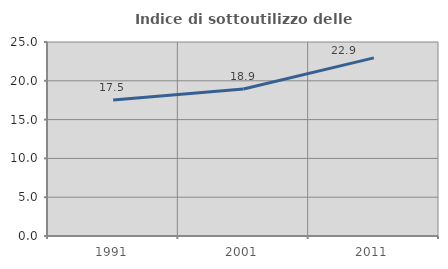
| Category | Indice di sottoutilizzo delle abitazioni  |
|---|---|
| 1991.0 | 17.517 |
| 2001.0 | 18.935 |
| 2011.0 | 22.95 |